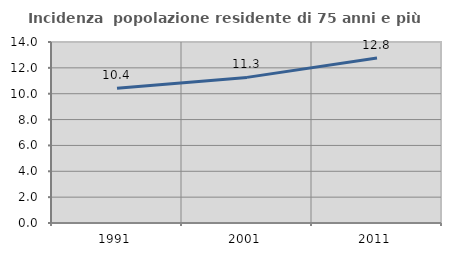
| Category | Incidenza  popolazione residente di 75 anni e più |
|---|---|
| 1991.0 | 10.429 |
| 2001.0 | 11.263 |
| 2011.0 | 12.766 |